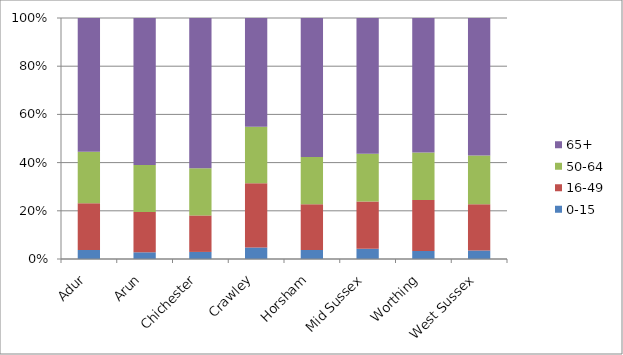
| Category | 0-15 | 16-49 | 50-64 | 65+ |
|---|---|---|---|---|
| Adur  | 459 | 2390 | 2624 | 6829 |
| Arun | 877 | 5270 | 6148 | 19194 |
| Chichester | 584 | 3011 | 3882 | 12406 |
| Crawley | 752 | 4180 | 3684 | 7086 |
| Horsham | 732 | 3667 | 3817 | 11191 |
| Mid Sussex | 840 | 3887 | 3932 | 11162 |
| Worthing | 679 | 4292 | 3986 | 11319 |
| West Sussex | 4923 | 26697 | 28073 | 79187 |